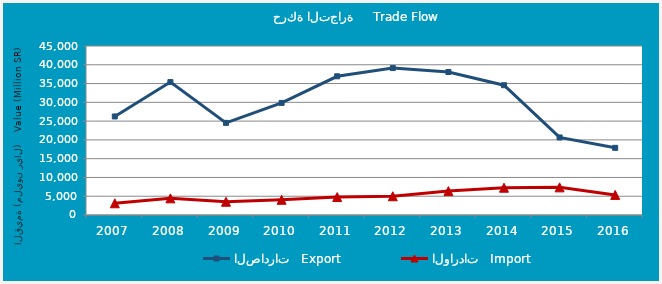
| Category | الصادرات   Export | الواردات   Import |
|---|---|---|
| 2007.0 | 26237.968 | 3116.445 |
| 2008.0 | 35388.93 | 4429.271 |
| 2009.0 | 24533.984 | 3529.592 |
| 2010.0 | 29849.417 | 4044.019 |
| 2011.0 | 36934.934 | 4779.764 |
| 2012.0 | 39121.34 | 4996.461 |
| 2013.0 | 38080.595 | 6359.873 |
| 2014.0 | 34558.93 | 7265.596 |
| 2015.0 | 20652.295 | 7359.149 |
| 2016.0 | 17884.385 | 5352.566 |